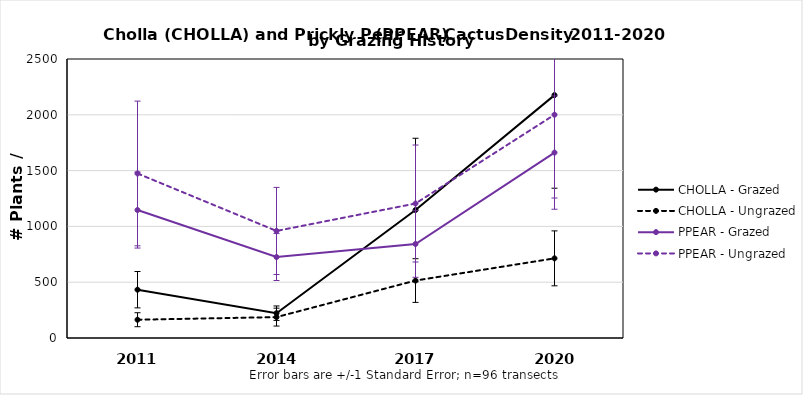
| Category | CHOLLA - Grazed | CHOLLA - Ungrazed | PPEAR - Grazed | PPEAR - Ungrazed |
|---|---|---|---|---|
| 2011.0 | 432.896 | 163.798 | 1146.589 | 1474.186 |
| 2014.0 | 222.298 | 187.198 | 725.393 | 959.391 |
| 2017.0 | 1146.589 | 514.795 | 842.392 | 1205.089 |
| 2020.0 | 2176.18 | 713.693 | 1661.385 | 2000.681 |